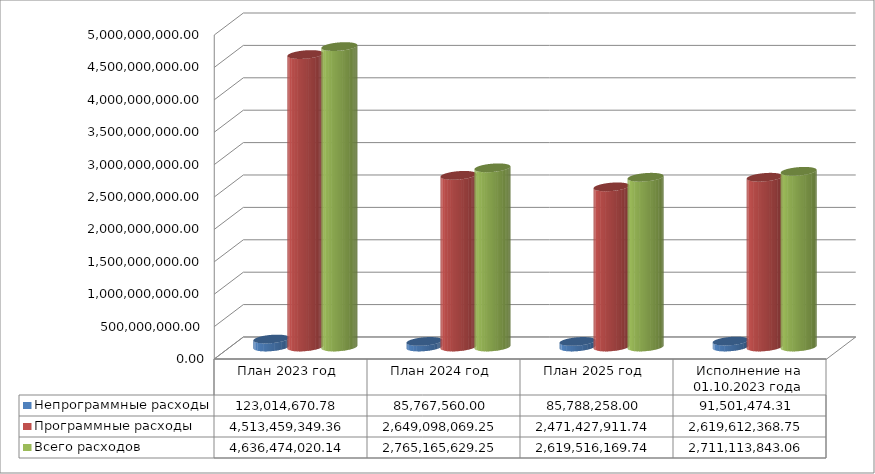
| Category | Непрограммные расходы | Программные расходы | Всего расходов |
|---|---|---|---|
| План 2023 год | 123014670.78 | 4513459349.36 | 4636474020.14 |
| План 2024 год | 85767560 | 2649098069.25 | 2765165629.25 |
| План 2025 год | 85788258 | 2471427911.74 | 2619516169.74 |
| Исполнение на 01.10.2023 года | 91501474.31 | 2619612368.75 | 2711113843.06 |